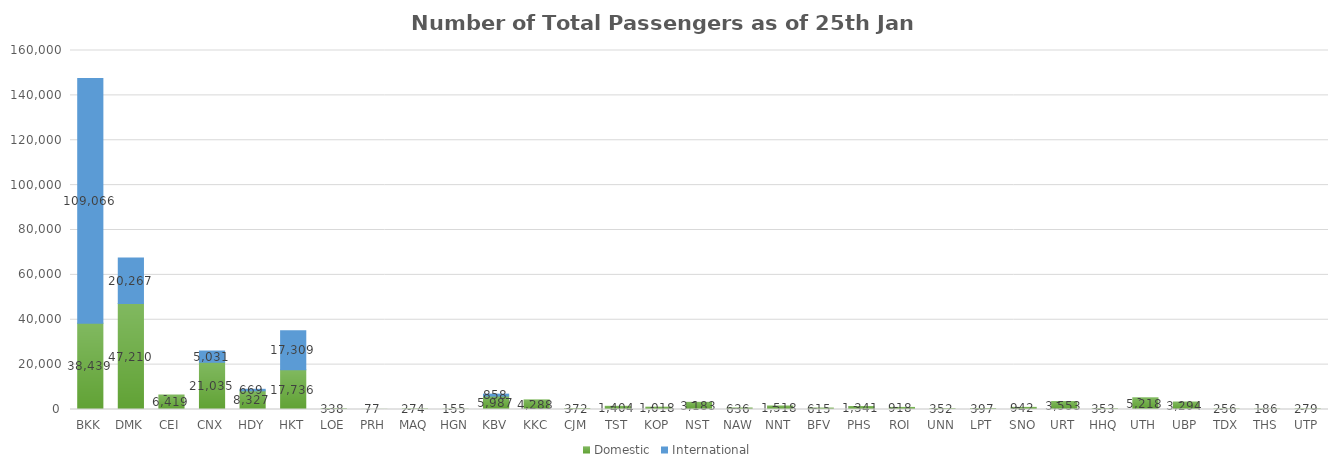
| Category | Domestic | International |
|---|---|---|
| BKK | 38439 | 109066 |
| DMK | 47210 | 20267 |
| CEI | 6419 | 0 |
| CNX | 21035 | 5031 |
| HDY | 8327 | 669 |
| HKT | 17736 | 17309 |
| LOE | 338 | 0 |
| PRH | 77 | 0 |
| MAQ | 274 | 0 |
| HGN | 155 | 0 |
| KBV | 5987 | 858 |
| KKC | 4288 | 0 |
| CJM | 372 | 0 |
| TST | 1404 | 0 |
| KOP | 1018 | 0 |
| NST | 3183 | 0 |
| NAW | 636 | 0 |
| NNT | 1518 | 0 |
| BFV | 615 | 0 |
| PHS | 1341 | 0 |
| ROI | 918 | 0 |
| UNN | 352 | 0 |
| LPT | 397 | 0 |
| SNO | 942 | 0 |
| URT | 3553 | 0 |
| HHQ | 353 | 0 |
| UTH | 5218 | 0 |
| UBP | 3294 | 0 |
| TDX | 256 | 0 |
| THS | 186 | 0 |
| UTP | 279 | 0 |